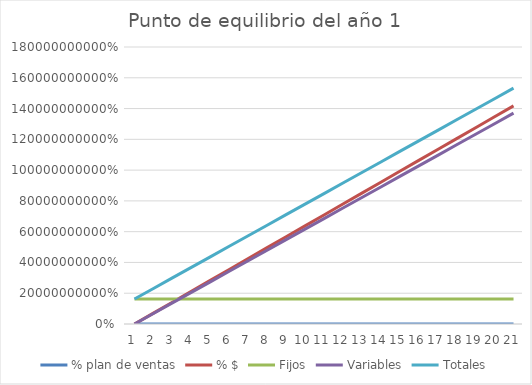
| Category | % plan de ventas | % $ | Fijos | Variables | Totales |
|---|---|---|---|---|---|
| 0 | 0 | 0 | 162570606.308 | 0 | 162570606.308 |
| 1 | 0.05 | 70875000 | 162570606.308 | 68495949.848 | 231066556.156 |
| 2 | 0.1 | 141750000 | 162570606.308 | 136991899.695 | 299562506.003 |
| 3 | 0.15 | 212625000 | 162570606.308 | 205487849.543 | 368058455.851 |
| 4 | 0.2 | 283500000 | 162570606.308 | 273983799.39 | 436554405.698 |
| 5 | 0.25 | 354375000 | 162570606.308 | 342479749.238 | 505050355.546 |
| 6 | 0.3 | 425250000 | 162570606.308 | 410975699.085 | 573546305.393 |
| 7 | 0.35 | 496125000 | 162570606.308 | 479471648.933 | 642042255.241 |
| 8 | 0.4 | 567000000 | 162570606.308 | 547967598.78 | 710538205.088 |
| 9 | 0.45 | 637875000 | 162570606.308 | 616463548.628 | 779034154.936 |
| 10 | 0.5 | 708750000 | 162570606.308 | 684959498.475 | 847530104.783 |
| 11 | 0.55 | 779625000 | 162570606.308 | 753455448.323 | 916026054.631 |
| 12 | 0.6 | 850500000 | 162570606.308 | 821951398.17 | 984522004.478 |
| 13 | 0.65 | 921375000 | 162570606.308 | 890447348.018 | 1053017954.326 |
| 14 | 0.7 | 992250000 | 162570606.308 | 958943297.865 | 1121513904.173 |
| 15 | 0.75 | 1063125000 | 162570606.308 | 1027439247.713 | 1190009854.021 |
| 16 | 0.8 | 1134000000 | 162570606.308 | 1095935197.56 | 1258505803.868 |
| 17 | 0.85 | 1204875000 | 162570606.308 | 1164431147.408 | 1327001753.716 |
| 18 | 0.9 | 1275750000 | 162570606.308 | 1232927097.255 | 1395497703.563 |
| 19 | 0.95 | 1346625000 | 162570606.308 | 1301423047.103 | 1463993653.411 |
| 20 | 1 | 1417500000 | 162570606.308 | 1369918996.95 | 1532489603.258 |